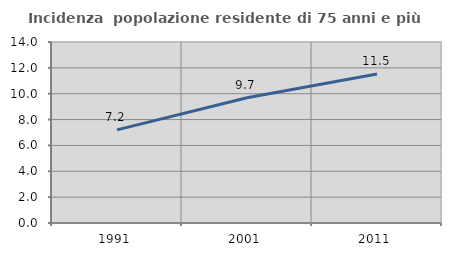
| Category | Incidenza  popolazione residente di 75 anni e più |
|---|---|
| 1991.0 | 7.205 |
| 2001.0 | 9.69 |
| 2011.0 | 11.522 |